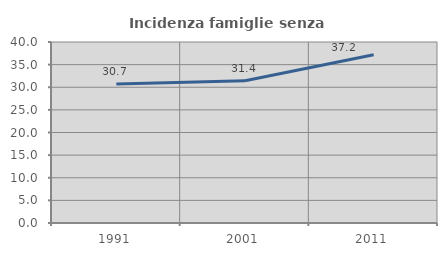
| Category | Incidenza famiglie senza nuclei |
|---|---|
| 1991.0 | 30.693 |
| 2001.0 | 31.448 |
| 2011.0 | 37.17 |